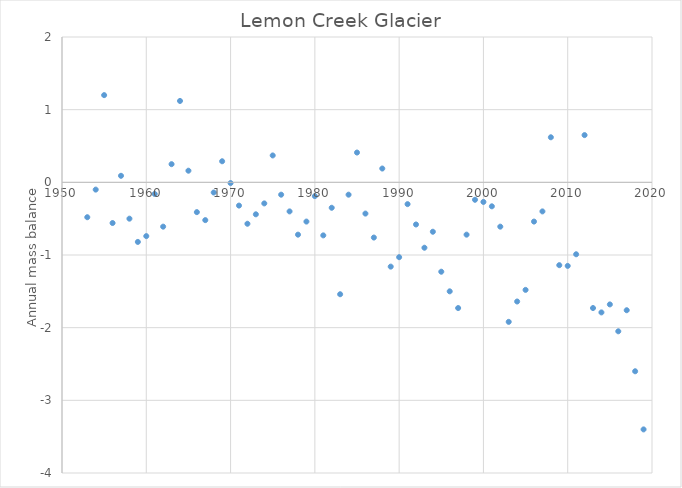
| Category | Lemon Creek Glacier |
|---|---|
| 1953.0 | -0.48 |
| 1954.0 | -0.1 |
| 1955.0 | 1.2 |
| 1956.0 | -0.56 |
| 1957.0 | 0.09 |
| 1958.0 | -0.5 |
| 1959.0 | -0.82 |
| 1960.0 | -0.74 |
| 1961.0 | -0.16 |
| 1962.0 | -0.61 |
| 1963.0 | 0.25 |
| 1964.0 | 1.12 |
| 1965.0 | 0.16 |
| 1966.0 | -0.41 |
| 1967.0 | -0.52 |
| 1968.0 | -0.14 |
| 1969.0 | 0.29 |
| 1970.0 | -0.01 |
| 1971.0 | -0.32 |
| 1972.0 | -0.57 |
| 1973.0 | -0.44 |
| 1974.0 | -0.29 |
| 1975.0 | 0.37 |
| 1976.0 | -0.17 |
| 1977.0 | -0.4 |
| 1978.0 | -0.72 |
| 1979.0 | -0.54 |
| 1980.0 | -0.19 |
| 1981.0 | -0.73 |
| 1982.0 | -0.35 |
| 1983.0 | -1.54 |
| 1984.0 | -0.17 |
| 1985.0 | 0.41 |
| 1986.0 | -0.43 |
| 1987.0 | -0.76 |
| 1988.0 | 0.19 |
| 1989.0 | -1.16 |
| 1990.0 | -1.03 |
| 1991.0 | -0.3 |
| 1992.0 | -0.58 |
| 1993.0 | -0.9 |
| 1994.0 | -0.68 |
| 1995.0 | -1.23 |
| 1996.0 | -1.5 |
| 1997.0 | -1.73 |
| 1998.0 | -0.72 |
| 1999.0 | -0.24 |
| 2000.0 | -0.27 |
| 2001.0 | -0.33 |
| 2002.0 | -0.61 |
| 2003.0 | -1.92 |
| 2004.0 | -1.64 |
| 2005.0 | -1.48 |
| 2006.0 | -0.54 |
| 2007.0 | -0.4 |
| 2008.0 | 0.62 |
| 2009.0 | -1.14 |
| 2010.0 | -1.15 |
| 2011.0 | -0.99 |
| 2012.0 | 0.65 |
| 2013.0 | -1.73 |
| 2014.0 | -1.79 |
| 2015.0 | -1.68 |
| 2016.0 | -2.05 |
| 2017.0 | -1.76 |
| 2018.0 | -2.6 |
| 2019.0 | -3.4 |